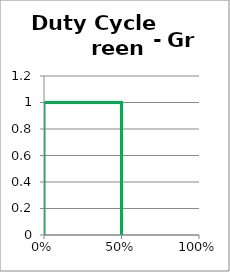
| Category | Green |
|---|---|
| 0.0 | 0 |
| 0.0 | 1 |
| 0.5 | 1 |
| 0.5 | 0 |